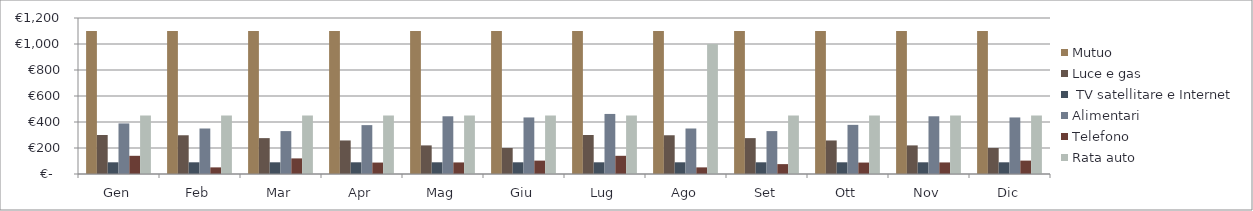
| Category | Mutuo | Luce e gas |  TV satellitare e Internet | Alimentari | Telefono | Rata auto |
|---|---|---|---|---|---|---|
| Gen | 1100 | 300 | 90 | 389 | 140 | 450 |
| Feb | 1100 | 298 | 90 | 350 | 50.93 | 450 |
| Mar | 1100 | 276 | 90 | 330 | 120 | 450 |
| Apr | 1100 | 258 | 90 | 376 | 88 | 450 |
| Mag | 1100 | 220 | 90 | 444 | 89 | 450 |
| Giu | 1100 | 200 | 90 | 435 | 103 | 450 |
| Lug | 1100 | 300 | 90 | 462 | 140 | 450 |
| Ago | 1100 | 298 | 90 | 350 | 50.93 | 1000 |
| Set | 1100 | 276 | 90 | 330 | 76 | 450 |
| Ott | 1100 | 258 | 90 | 378 | 88 | 450 |
| Nov | 1100 | 220 | 90 | 444 | 89 | 450 |
| Dic | 1100 | 200 | 90 | 435 | 103 | 450 |